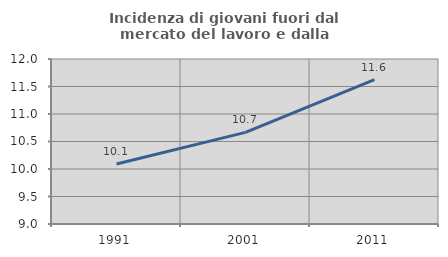
| Category | Incidenza di giovani fuori dal mercato del lavoro e dalla formazione  |
|---|---|
| 1991.0 | 10.092 |
| 2001.0 | 10.665 |
| 2011.0 | 11.623 |